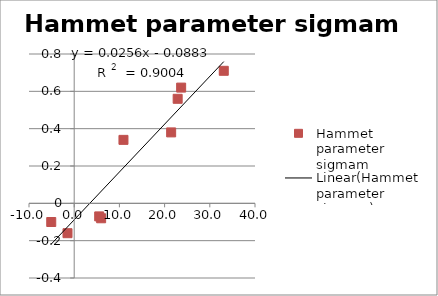
| Category | Hammet parameter sigmam |
|---|---|
| -1.4800000000395812 | -0.16 |
| -5.08 | -0.1 |
| 5.960000000020955 | -0.08 |
| 5.53000000002794 | -0.07 |
| 10.900000000023283 | 0.34 |
| 21.45 | 0.38 |
| 22.89000000001397 | 0.56 |
| 23.65999999997439 | 0.62 |
| 33.089999999967404 | 0.71 |